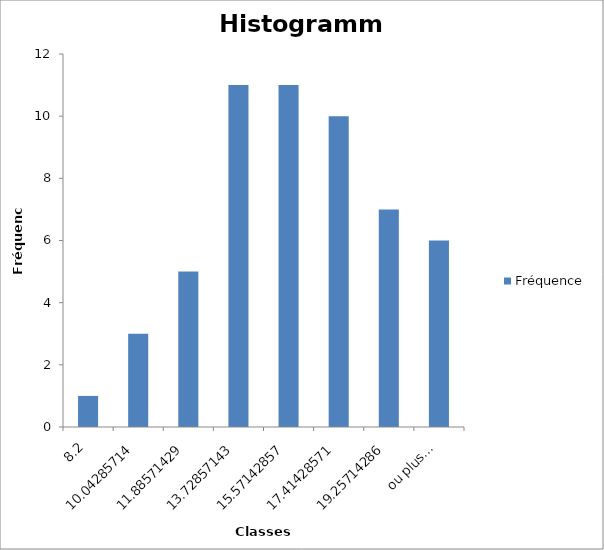
| Category | Fréquence |
|---|---|
| 8,2 | 1 |
| 10,04285714 | 3 |
| 11,88571429 | 5 |
| 13,72857143 | 11 |
| 15,57142857 | 11 |
| 17,41428571 | 10 |
| 19,25714286 | 7 |
| ou plus... | 6 |